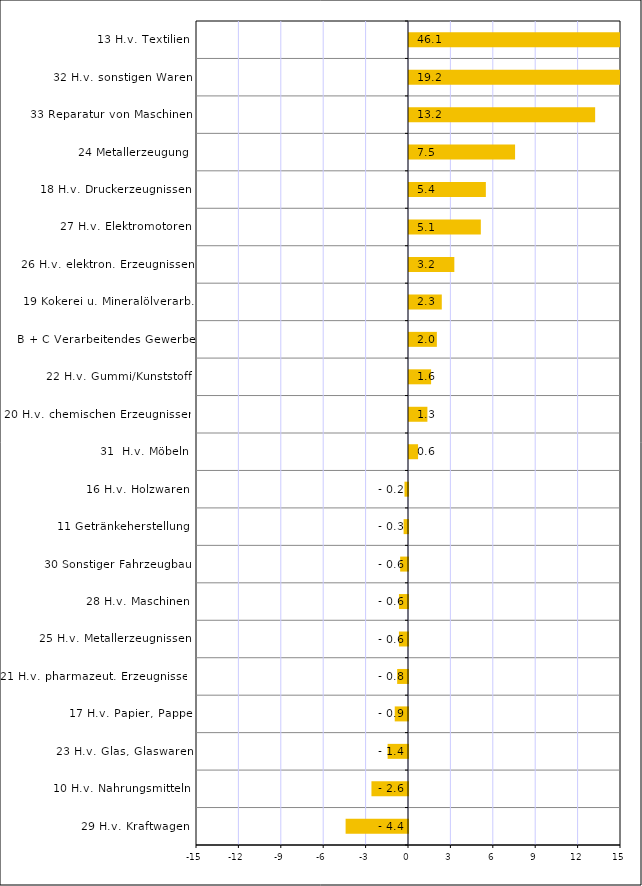
| Category | Series 0 |
|---|---|
| 29 H.v. Kraftwagen | -4.415 |
| 10 H.v. Nahrungsmitteln | -2.586 |
| 23 H.v. Glas, Glaswaren | -1.442 |
| 17 H.v. Papier, Pappe | -0.938 |
| 21 H.v. pharmazeut. Erzeugnissen | -0.767 |
| 25 H.v. Metallerzeugnissen | -0.642 |
| 28 H.v. Maschinen | -0.64 |
| 30 Sonstiger Fahrzeugbau | -0.555 |
| 11 Getränkeherstellung | -0.311 |
| 16 H.v. Holzwaren | -0.249 |
| 31  H.v. Möbeln | 0.642 |
| 20 H.v. chemischen Erzeugnissen | 1.302 |
| 22 H.v. Gummi/Kunststoff | 1.564 |
| B + C Verarbeitendes Gewerbe | 1.972 |
| 19 Kokerei u. Mineralölverarb. | 2.32 |
| 26 H.v. elektron. Erzeugnissen | 3.207 |
| 27 H.v. Elektromotoren | 5.082 |
| 18 H.v. Druckerzeugnissen | 5.438 |
| 24 Metallerzeugung | 7.506 |
| 33 Reparatur von Maschinen | 13.171 |
| 32 H.v. sonstigen Waren | 19.165 |
| 13 H.v. Textilien | 46.128 |